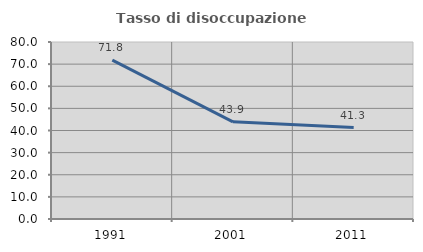
| Category | Tasso di disoccupazione giovanile  |
|---|---|
| 1991.0 | 71.827 |
| 2001.0 | 43.902 |
| 2011.0 | 41.304 |